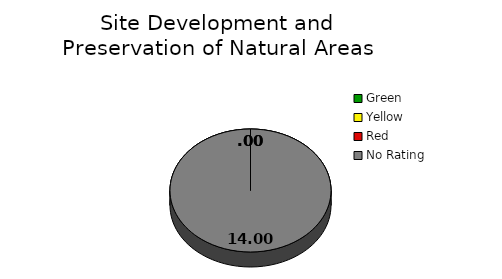
| Category | Counts |
|---|---|
| Green | 0 |
| Yellow | 0 |
| Red | 0 |
| No Rating | 14 |